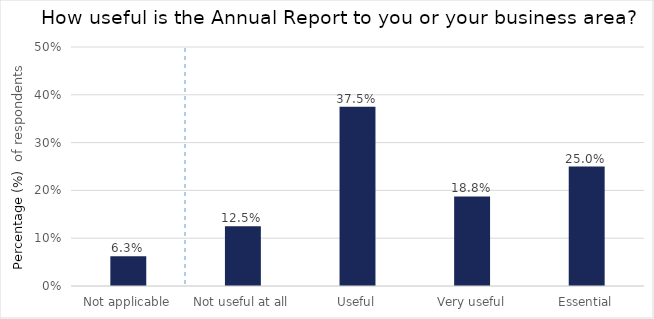
| Category | Not applicable |
|---|---|
| Not applicable | 0.062 |
| Not useful at all | 0.125 |
| Useful | 0.375 |
| Very useful | 0.188 |
| Essential | 0.25 |